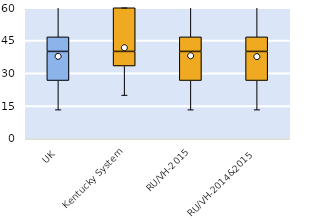
| Category | 25th | 50th | 75th |
|---|---|---|---|
| UK | 26.667 | 13.333 | 6.667 |
| Kentucky System | 33.333 | 6.667 | 20 |
| RU/VH-2015 | 26.667 | 13.333 | 6.667 |
| RU/VH-2014&2015 | 26.667 | 13.333 | 6.667 |